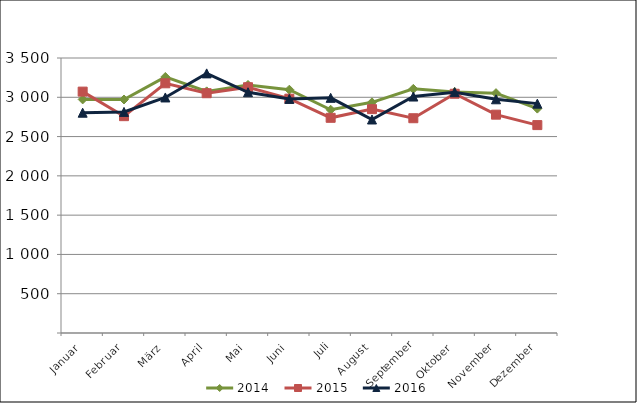
| Category | 2014 | 2015 | 2016 |
|---|---|---|---|
| Januar | 2972.91 | 3072.064 | 2803.654 |
| Februar | 2971.852 | 2759.706 | 2813.982 |
| März | 3258.846 | 3177.937 | 2997.855 |
| April | 3075.389 | 3051.689 | 3304.19 |
| Mai | 3156.743 | 3128.043 | 3064.092 |
| Juni | 3096.493 | 2982.352 | 2979.239 |
| Juli | 2841.639 | 2738.818 | 2992.931 |
| August | 2935.673 | 2849.083 | 2717.355 |
| September | 3107.04 | 2733.484 | 3009.501 |
| Oktober | 3067.802 | 3044.904 | 3065.106 |
| November | 3052.711 | 2778.783 | 2974.577 |
| Dezember | 2855.924 | 2646.005 | 2919.295 |